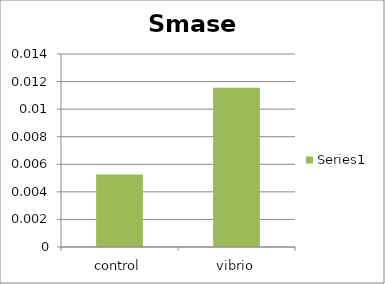
| Category | Series 0 |
|---|---|
| control | 0.005 |
| vibrio | 0.012 |